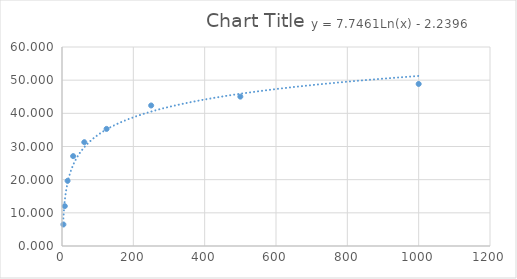
| Category | Series 0 |
|---|---|
| 3.91 | 6.489 |
| 7.81 | 12.023 |
| 15.62 | 19.656 |
| 31.25 | 27.099 |
| 62.5 | 31.298 |
| 125.0 | 35.305 |
| 250.0 | 42.366 |
| 500.0 | 45.038 |
| 1000.0 | 48.855 |